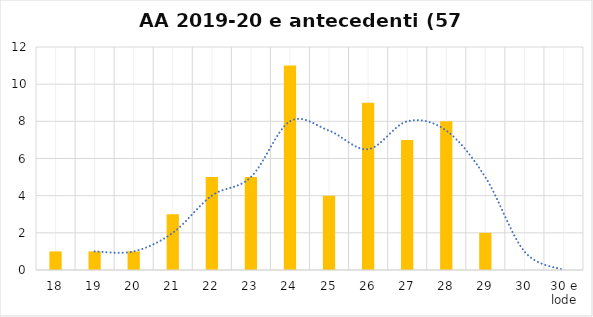
| Category | Series 0 |
|---|---|
| 18 | 1 |
| 19 | 1 |
| 20 | 1 |
| 21 | 3 |
| 22 | 5 |
| 23 | 5 |
| 24 | 11 |
| 25 | 4 |
| 26 | 9 |
| 27 | 7 |
| 28 | 8 |
| 29 | 2 |
| 30 | 0 |
| 30 e lode | 0 |